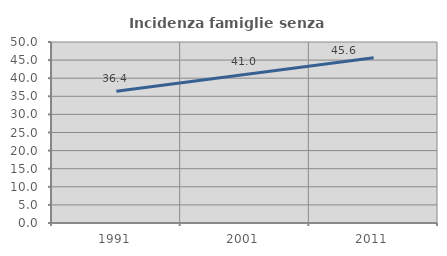
| Category | Incidenza famiglie senza nuclei |
|---|---|
| 1991.0 | 36.425 |
| 2001.0 | 41.023 |
| 2011.0 | 45.621 |